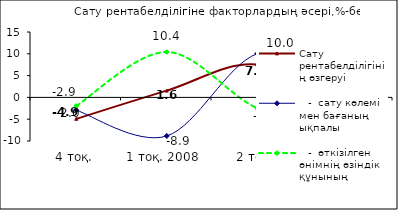
| Category | Сату рентабелділігінің өзгеруі |    -  сату көлемі мен бағаның ықпалы |    -  өткізілген өнімнің өзіндік құнының ықпалы |
|---|---|---|---|
| 4 тоқ. | -4.913 | -2.944 | -1.969 |
| 1 тоқ. 2008  | 1.558 | -8.852 | 10.41 |
| 2 тоқ. | 7.535 | 10.012 | -2.477 |
| 3 тоқ. | -3.119 | 5.119 | -8.238 |